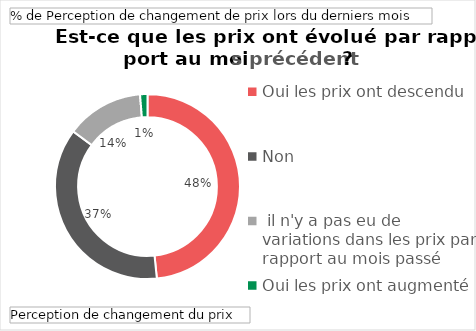
| Category | Total |
|---|---|
| Oui les prix ont descendu | 0.484 |
| Non, il n'y a pas eu de variations dans les prix par rapport au mois passé | 0.368 |
| Oui les prix ont augmenté | 0.135 |
| Je ne sais pas, je ne souhaite pas répondre | 0.013 |